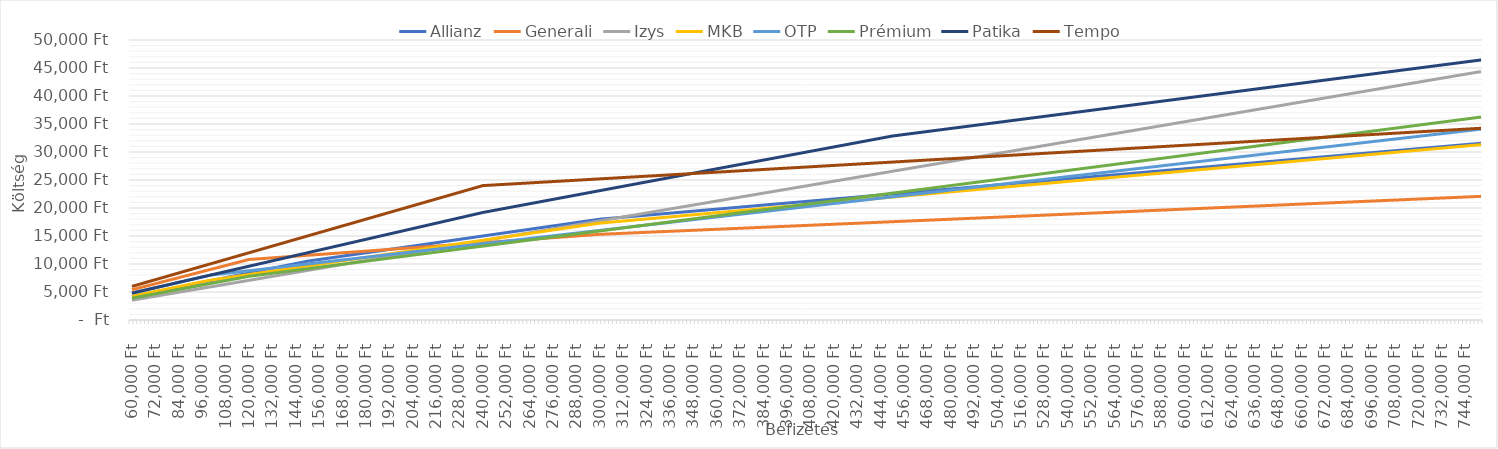
| Category | Allianz | Generali | Izys | MKB | OTP | Prémium | Patika | Tempo |
|---|---|---|---|---|---|---|---|---|
| 60000.0 | 4200 | 5400 | 3540 | 4260 | 4800 | 3900 | 4800 | 6000 |
| 62000.0 | 4340 | 5580 | 3658 | 4402 | 4960 | 4030 | 4960 | 6200 |
| 64000.0 | 4480 | 5760 | 3776 | 4544 | 5120 | 4160 | 5120 | 6400 |
| 66000.0 | 4620 | 5940 | 3894 | 4686 | 5280 | 4290 | 5280 | 6600 |
| 68000.0 | 4760 | 6120 | 4012 | 4828 | 5440 | 4420 | 5440 | 6800 |
| 70000.0 | 4900 | 6300 | 4130 | 4970 | 5600 | 4550 | 5600 | 7000 |
| 72000.0 | 5040 | 6480 | 4248 | 5112 | 5760 | 4680 | 5760 | 7200 |
| 74000.0 | 5180 | 6660 | 4366 | 5254 | 5920 | 4810 | 5920 | 7400 |
| 76000.0 | 5320 | 6840 | 4484 | 5396 | 6080 | 4940 | 6080 | 7600 |
| 78000.0 | 5460 | 7020 | 4602 | 5538 | 6240 | 5070 | 6240 | 7800 |
| 80000.0 | 5600 | 7200 | 4720 | 5680 | 6400 | 5200 | 6400 | 8000 |
| 82000.0 | 5740 | 7380 | 4838 | 5822 | 6560 | 5330 | 6560 | 8200 |
| 84000.0 | 5880 | 7560 | 4956 | 5964 | 6720 | 5460 | 6720 | 8400 |
| 86000.0 | 6020 | 7740 | 5074 | 6106 | 6880 | 5590 | 6880 | 8600 |
| 88000.0 | 6160 | 7920 | 5192 | 6248 | 7040 | 5720 | 7040 | 8800 |
| 90000.0 | 6300 | 8100 | 5310 | 6390 | 7200 | 5850 | 7200 | 9000 |
| 92000.0 | 6440 | 8280 | 5428 | 6532 | 7360 | 5980 | 7360 | 9200 |
| 94000.0 | 6580 | 8460 | 5546 | 6674 | 7520 | 6110 | 7520 | 9400 |
| 96000.0 | 6720 | 8640 | 5664 | 6816 | 7680 | 6240 | 7680 | 9600 |
| 98000.0 | 6860 | 8820 | 5782 | 6958 | 7840 | 6370 | 7840 | 9800 |
| 100000.0 | 7000 | 9000 | 5900 | 7100 | 8000 | 6500 | 8000 | 10000 |
| 102000.0 | 7140 | 9180 | 6018 | 7202 | 8080 | 6630 | 8160 | 10200 |
| 104000.0 | 7280 | 9360 | 6136 | 7304 | 8160 | 6760 | 8320 | 10400 |
| 106000.0 | 7420 | 9540 | 6254 | 7406 | 8240 | 6890 | 8480 | 10600 |
| 108000.0 | 7560 | 9720 | 6372 | 7508 | 8320 | 7020 | 8640 | 10800 |
| 110000.0 | 7700 | 9900 | 6490 | 7610 | 8400 | 7150 | 8800 | 11000 |
| 112000.0 | 7840 | 10080 | 6608 | 7712 | 8480 | 7280 | 8960 | 11200 |
| 114000.0 | 7980 | 10260 | 6726 | 7814 | 8560 | 7410 | 9120 | 11400 |
| 116000.0 | 8120 | 10440 | 6844 | 7916 | 8640 | 7540 | 9280 | 11600 |
| 118000.0 | 8260 | 10620 | 6962 | 8018 | 8720 | 7670 | 9440 | 11800 |
| 120000.0 | 8400 | 10800 | 7080 | 8120 | 8800 | 7800 | 9600 | 12000 |
| 122000.0 | 8540 | 10850 | 7198 | 8222 | 8880 | 7890 | 9760 | 12200 |
| 124000.0 | 8680 | 10900 | 7316 | 8324 | 8960 | 7980 | 9920 | 12400 |
| 126000.0 | 8820 | 10950 | 7434 | 8426 | 9040 | 8070 | 10080 | 12600 |
| 128000.0 | 8960 | 11000 | 7552 | 8528 | 9120 | 8160 | 10240 | 12800 |
| 130000.0 | 9100 | 11050 | 7670 | 8630 | 9200 | 8250 | 10400 | 13000 |
| 132000.0 | 9240 | 11100 | 7788 | 8732 | 9280 | 8340 | 10560 | 13200 |
| 134000.0 | 9380 | 11150 | 7906 | 8834 | 9360 | 8430 | 10720 | 13400 |
| 136000.0 | 9520 | 11200 | 8024 | 8936 | 9440 | 8520 | 10880 | 13600 |
| 138000.0 | 9660 | 11250 | 8142 | 9038 | 9520 | 8610 | 11040 | 13800 |
| 140000.0 | 9800 | 11300 | 8260 | 9140 | 9600 | 8700 | 11200 | 14000 |
| 142000.0 | 9940 | 11350 | 8378 | 9242 | 9680 | 8790 | 11360 | 14200 |
| 144000.0 | 10080 | 11400 | 8496 | 9344 | 9760 | 8880 | 11520 | 14400 |
| 146000.0 | 10220 | 11450 | 8614 | 9446 | 9840 | 8970 | 11680 | 14600 |
| 148000.0 | 10360 | 11500 | 8732 | 9548 | 9920 | 9060 | 11840 | 14800 |
| 150000.0 | 10500 | 11550 | 8850 | 9650 | 10000 | 9150 | 12000 | 15000 |
| 152000.0 | 10600 | 11600 | 8968 | 9752 | 10080 | 9240 | 12160 | 15200 |
| 154000.0 | 10700 | 11650 | 9086 | 9854 | 10160 | 9330 | 12320 | 15400 |
| 156000.0 | 10800 | 11700 | 9204 | 9956 | 10240 | 9420 | 12480 | 15600 |
| 158000.0 | 10900 | 11750 | 9322 | 10058 | 10320 | 9510 | 12640 | 15800 |
| 160000.0 | 11000 | 11800 | 9440 | 10160 | 10400 | 9600 | 12800 | 16000 |
| 162000.0 | 11100 | 11850 | 9558 | 10262 | 10480 | 9690 | 12960 | 16200 |
| 164000.0 | 11200 | 11900 | 9676 | 10364 | 10560 | 9780 | 13120 | 16400 |
| 166000.0 | 11300 | 11950 | 9794 | 10466 | 10640 | 9870 | 13280 | 16600 |
| 168000.0 | 11400 | 12000 | 9912 | 10568 | 10720 | 9960 | 13440 | 16800 |
| 170000.0 | 11500 | 12050 | 10030 | 10670 | 10800 | 10050 | 13600 | 17000 |
| 172000.0 | 11600 | 12100 | 10148 | 10772 | 10880 | 10140 | 13760 | 17200 |
| 174000.0 | 11700 | 12150 | 10266 | 10874 | 10960 | 10230 | 13920 | 17400 |
| 176000.0 | 11800 | 12200 | 10384 | 10976 | 11040 | 10320 | 14080 | 17600 |
| 178000.0 | 11900 | 12250 | 10502 | 11078 | 11120 | 10410 | 14240 | 17800 |
| 180000.0 | 12000 | 12300 | 10620 | 11180 | 11200 | 10500 | 14400 | 18000 |
| 182000.0 | 12100 | 12350 | 10738 | 11282 | 11280 | 10590 | 14560 | 18200 |
| 184000.0 | 12200 | 12400 | 10856 | 11384 | 11360 | 10680 | 14720 | 18400 |
| 186000.0 | 12300 | 12450 | 10974 | 11486 | 11440 | 10770 | 14880 | 18600 |
| 188000.0 | 12400 | 12500 | 11092 | 11588 | 11520 | 10860 | 15040 | 18800 |
| 190000.0 | 12500 | 12550 | 11210 | 11690 | 11600 | 10950 | 15200 | 19000 |
| 192000.0 | 12600 | 12600 | 11328 | 11792 | 11680 | 11040 | 15360 | 19200 |
| 194000.0 | 12700 | 12650 | 11446 | 11894 | 11760 | 11130 | 15520 | 19400 |
| 196000.0 | 12800 | 12700 | 11564 | 11996 | 11840 | 11220 | 15680 | 19600 |
| 198000.0 | 12900 | 12750 | 11682 | 12098 | 11920 | 11310 | 15840 | 19800 |
| 200000.0 | 13000 | 12800 | 11800 | 12200 | 12000 | 11400 | 16000 | 20000 |
| 202000.0 | 13100 | 12850 | 11918 | 12302 | 12080 | 11490 | 16160 | 20200 |
| 204000.0 | 13200 | 12900 | 12036 | 12404 | 12160 | 11580 | 16320 | 20400 |
| 206000.0 | 13300 | 12950 | 12154 | 12506 | 12240 | 11670 | 16480 | 20600 |
| 208000.0 | 13400 | 13000 | 12272 | 12608 | 12320 | 11760 | 16640 | 20800 |
| 210000.0 | 13500 | 13050 | 12390 | 12710 | 12400 | 11850 | 16800 | 21000 |
| 212000.0 | 13600 | 13100 | 12508 | 12812 | 12480 | 11940 | 16960 | 21200 |
| 214000.0 | 13700 | 13150 | 12626 | 12914 | 12560 | 12030 | 17120 | 21400 |
| 216000.0 | 13800 | 13200 | 12744 | 13016 | 12640 | 12120 | 17280 | 21600 |
| 218000.0 | 13900 | 13250 | 12862 | 13118 | 12720 | 12210 | 17440 | 21800 |
| 220000.0 | 14000 | 13300 | 12980 | 13220 | 12800 | 12300 | 17600 | 22000 |
| 222000.0 | 14100 | 13350 | 13098 | 13322 | 12880 | 12390 | 17760 | 22200 |
| 224000.0 | 14200 | 13400 | 13216 | 13424 | 12960 | 12480 | 17920 | 22400 |
| 226000.0 | 14300 | 13450 | 13334 | 13526 | 13040 | 12570 | 18080 | 22600 |
| 228000.0 | 14400 | 13500 | 13452 | 13628 | 13120 | 12660 | 18240 | 22800 |
| 230000.0 | 14500 | 13550 | 13570 | 13730 | 13200 | 12750 | 18400 | 23000 |
| 232000.0 | 14600 | 13600 | 13688 | 13832 | 13280 | 12840 | 18560 | 23200 |
| 234000.0 | 14700 | 13650 | 13806 | 13934 | 13360 | 12930 | 18720 | 23400 |
| 236000.0 | 14800 | 13700 | 13924 | 14036 | 13440 | 13020 | 18880 | 23600 |
| 238000.0 | 14900 | 13750 | 14042 | 14138 | 13520 | 13110 | 19040 | 23800 |
| 240000.0 | 15000 | 13800 | 14160 | 14240 | 13600 | 13200 | 19200 | 24000 |
| 242000.0 | 15100 | 13850 | 14278 | 14342 | 13680 | 13290 | 19330 | 24040 |
| 244000.0 | 15200 | 13900 | 14396 | 14444 | 13760 | 13380 | 19460 | 24080 |
| 246000.0 | 15300 | 13950 | 14514 | 14546 | 13840 | 13470 | 19590 | 24120 |
| 248000.0 | 15400 | 14000 | 14632 | 14648 | 13920 | 13560 | 19720 | 24160 |
| 250000.0 | 15500 | 14050 | 14750 | 14750 | 14000 | 13650 | 19850 | 24200 |
| 252000.0 | 15600 | 14100 | 14868 | 14852 | 14080 | 13740 | 19980 | 24240 |
| 254000.0 | 15700 | 14150 | 14986 | 14954 | 14160 | 13830 | 20110 | 24280 |
| 256000.0 | 15800 | 14200 | 15104 | 15056 | 14240 | 13920 | 20240 | 24320 |
| 258000.0 | 15900 | 14250 | 15222 | 15158 | 14320 | 14010 | 20370 | 24360 |
| 260000.0 | 16000 | 14300 | 15340 | 15260 | 14400 | 14100 | 20500 | 24400 |
| 262000.0 | 16100 | 14350 | 15458 | 15362 | 14480 | 14190 | 20630 | 24440 |
| 264000.0 | 16200 | 14400 | 15576 | 15464 | 14560 | 14280 | 20760 | 24480 |
| 266000.0 | 16300 | 14450 | 15694 | 15566 | 14640 | 14370 | 20890 | 24520 |
| 268000.0 | 16400 | 14500 | 15812 | 15668 | 14720 | 14460 | 21020 | 24560 |
| 270000.0 | 16500 | 14550 | 15930 | 15770 | 14800 | 14550 | 21150 | 24600 |
| 272000.0 | 16600 | 14600 | 16048 | 15872 | 14880 | 14640 | 21280 | 24640 |
| 274000.0 | 16700 | 14650 | 16166 | 15974 | 14960 | 14730 | 21410 | 24680 |
| 276000.0 | 16800 | 14700 | 16284 | 16076 | 15040 | 14820 | 21540 | 24720 |
| 278000.0 | 16900 | 14750 | 16402 | 16178 | 15120 | 14910 | 21670 | 24760 |
| 280000.0 | 17000 | 14800 | 16520 | 16280 | 15200 | 15000 | 21800 | 24800 |
| 282000.0 | 17100 | 14850 | 16638 | 16382 | 15280 | 15090 | 21930 | 24840 |
| 284000.0 | 17200 | 14900 | 16756 | 16484 | 15360 | 15180 | 22060 | 24880 |
| 286000.0 | 17300 | 14950 | 16874 | 16586 | 15440 | 15270 | 22190 | 24920 |
| 288000.0 | 17400 | 15000 | 16992 | 16688 | 15520 | 15360 | 22320 | 24960 |
| 290000.0 | 17500 | 15050 | 17110 | 16790 | 15600 | 15450 | 22450 | 25000 |
| 292000.0 | 17600 | 15100 | 17228 | 16892 | 15680 | 15540 | 22580 | 25040 |
| 294000.0 | 17700 | 15150 | 17346 | 16994 | 15760 | 15630 | 22710 | 25080 |
| 296000.0 | 17800 | 15200 | 17464 | 17096 | 15840 | 15720 | 22840 | 25120 |
| 298000.0 | 17900 | 15250 | 17582 | 17198 | 15920 | 15810 | 22970 | 25160 |
| 300000.0 | 18000 | 15300 | 17700 | 17300 | 16000 | 15900 | 23100 | 25200 |
| 302000.0 | 18060 | 15330 | 17818 | 17362 | 16080 | 15990 | 23230 | 25240 |
| 304000.0 | 18120 | 15360 | 17936 | 17424 | 16160 | 16080 | 23360 | 25280 |
| 306000.0 | 18180 | 15390 | 18054 | 17486 | 16240 | 16170 | 23490 | 25320 |
| 308000.0 | 18240 | 15420 | 18172 | 17548 | 16320 | 16260 | 23620 | 25360 |
| 310000.0 | 18300 | 15450 | 18290 | 17610 | 16400 | 16350 | 23750 | 25400 |
| 312000.0 | 18360 | 15480 | 18408 | 17672 | 16480 | 16440 | 23880 | 25440 |
| 314000.0 | 18420 | 15510 | 18526 | 17734 | 16560 | 16530 | 24010 | 25480 |
| 316000.0 | 18480 | 15540 | 18644 | 17796 | 16640 | 16620 | 24140 | 25520 |
| 318000.0 | 18540 | 15570 | 18762 | 17858 | 16720 | 16710 | 24270 | 25560 |
| 320000.0 | 18600 | 15600 | 18880 | 17920 | 16800 | 16800 | 24400 | 25600 |
| 322000.0 | 18660 | 15630 | 18998 | 17982 | 16880 | 16890 | 24530 | 25640 |
| 324000.0 | 18720 | 15660 | 19116 | 18044 | 16960 | 16980 | 24660 | 25680 |
| 326000.0 | 18780 | 15690 | 19234 | 18106 | 17040 | 17070 | 24790 | 25720 |
| 328000.0 | 18840 | 15720 | 19352 | 18168 | 17120 | 17160 | 24920 | 25760 |
| 330000.0 | 18900 | 15750 | 19470 | 18230 | 17200 | 17250 | 25050 | 25800 |
| 332000.0 | 18960 | 15780 | 19588 | 18292 | 17280 | 17340 | 25180 | 25840 |
| 334000.0 | 19020 | 15810 | 19706 | 18354 | 17360 | 17430 | 25310 | 25880 |
| 336000.0 | 19080 | 15840 | 19824 | 18416 | 17440 | 17520 | 25440 | 25920 |
| 338000.0 | 19140 | 15870 | 19942 | 18478 | 17520 | 17610 | 25570 | 25960 |
| 340000.0 | 19200 | 15900 | 20060 | 18540 | 17600 | 17700 | 25700 | 26000 |
| 342000.0 | 19260 | 15930 | 20178 | 18602 | 17680 | 17790 | 25830 | 26040 |
| 344000.0 | 19320 | 15960 | 20296 | 18664 | 17760 | 17880 | 25960 | 26080 |
| 346000.0 | 19380 | 15990 | 20414 | 18726 | 17840 | 17970 | 26090 | 26120 |
| 348000.0 | 19440 | 16020 | 20532 | 18788 | 17920 | 18060 | 26220 | 26160 |
| 350000.0 | 19500 | 16050 | 20650 | 18850 | 18000 | 18150 | 26350 | 26200 |
| 352000.0 | 19560 | 16080 | 20768 | 18912 | 18080 | 18240 | 26480 | 26240 |
| 354000.0 | 19620 | 16110 | 20886 | 18974 | 18160 | 18330 | 26610 | 26280 |
| 356000.0 | 19680 | 16140 | 21004 | 19036 | 18240 | 18420 | 26740 | 26320 |
| 358000.0 | 19740 | 16170 | 21122 | 19098 | 18320 | 18510 | 26870 | 26360 |
| 360000.0 | 19800 | 16200 | 21240 | 19160 | 18400 | 18600 | 27000 | 26400 |
| 362000.0 | 19860 | 16230 | 21358 | 19222 | 18480 | 18690 | 27130 | 26440 |
| 364000.0 | 19920 | 16260 | 21476 | 19284 | 18560 | 18780 | 27260 | 26480 |
| 366000.0 | 19980 | 16290 | 21594 | 19346 | 18640 | 18870 | 27390 | 26520 |
| 368000.0 | 20040 | 16320 | 21712 | 19408 | 18720 | 18960 | 27520 | 26560 |
| 370000.0 | 20100 | 16350 | 21830 | 19470 | 18800 | 19050 | 27650 | 26600 |
| 372000.0 | 20160 | 16380 | 21948 | 19532 | 18880 | 19140 | 27780 | 26640 |
| 374000.0 | 20220 | 16410 | 22066 | 19594 | 18960 | 19230 | 27910 | 26680 |
| 376000.0 | 20280 | 16440 | 22184 | 19656 | 19040 | 19320 | 28040 | 26720 |
| 378000.0 | 20340 | 16470 | 22302 | 19718 | 19120 | 19410 | 28170 | 26760 |
| 380000.0 | 20400 | 16500 | 22420 | 19780 | 19200 | 19500 | 28300 | 26800 |
| 382000.0 | 20460 | 16530 | 22538 | 19842 | 19280 | 19590 | 28430 | 26840 |
| 384000.0 | 20520 | 16560 | 22656 | 19904 | 19360 | 19680 | 28560 | 26880 |
| 386000.0 | 20580 | 16590 | 22774 | 19966 | 19440 | 19770 | 28690 | 26920 |
| 388000.0 | 20640 | 16620 | 22892 | 20028 | 19520 | 19860 | 28820 | 26960 |
| 390000.0 | 20700 | 16650 | 23010 | 20090 | 19600 | 19950 | 28950 | 27000 |
| 392000.0 | 20760 | 16680 | 23128 | 20152 | 19680 | 20040 | 29080 | 27040 |
| 394000.0 | 20820 | 16710 | 23246 | 20214 | 19760 | 20130 | 29210 | 27080 |
| 396000.0 | 20880 | 16740 | 23364 | 20276 | 19840 | 20220 | 29340 | 27120 |
| 398000.0 | 20940 | 16770 | 23482 | 20338 | 19920 | 20310 | 29470 | 27160 |
| 400000.0 | 21000 | 16800 | 23600 | 20400 | 20000 | 20400 | 29600 | 27200 |
| 402000.0 | 21060 | 16830 | 23718 | 20462 | 20080 | 20490 | 29730 | 27240 |
| 404000.0 | 21120 | 16860 | 23836 | 20524 | 20160 | 20580 | 29860 | 27280 |
| 406000.0 | 21180 | 16890 | 23954 | 20586 | 20240 | 20670 | 29990 | 27320 |
| 408000.0 | 21240 | 16920 | 24072 | 20648 | 20320 | 20760 | 30120 | 27360 |
| 410000.0 | 21300 | 16950 | 24190 | 20710 | 20400 | 20850 | 30250 | 27400 |
| 412000.0 | 21360 | 16980 | 24308 | 20772 | 20480 | 20940 | 30380 | 27440 |
| 414000.0 | 21420 | 17010 | 24426 | 20834 | 20560 | 21030 | 30510 | 27480 |
| 416000.0 | 21480 | 17040 | 24544 | 20896 | 20640 | 21120 | 30640 | 27520 |
| 418000.0 | 21540 | 17070 | 24662 | 20958 | 20720 | 21210 | 30770 | 27560 |
| 420000.0 | 21600 | 17100 | 24780 | 21020 | 20800 | 21300 | 30900 | 27600 |
| 422000.0 | 21660 | 17130 | 24898 | 21082 | 20880 | 21390 | 31030 | 27640 |
| 424000.0 | 21720 | 17160 | 25016 | 21144 | 20960 | 21480 | 31160 | 27680 |
| 426000.0 | 21780 | 17190 | 25134 | 21206 | 21040 | 21570 | 31290 | 27720 |
| 428000.0 | 21840 | 17220 | 25252 | 21268 | 21120 | 21660 | 31420 | 27760 |
| 430000.0 | 21900 | 17250 | 25370 | 21330 | 21200 | 21750 | 31550 | 27800 |
| 432000.0 | 21960 | 17280 | 25488 | 21392 | 21280 | 21840 | 31680 | 27840 |
| 434000.0 | 22020 | 17310 | 25606 | 21454 | 21360 | 21930 | 31810 | 27880 |
| 436000.0 | 22080 | 17340 | 25724 | 21516 | 21440 | 22020 | 31940 | 27920 |
| 438000.0 | 22140 | 17370 | 25842 | 21578 | 21520 | 22110 | 32070 | 27960 |
| 440000.0 | 22200 | 17400 | 25960 | 21640 | 21600 | 22200 | 32200 | 28000 |
| 442000.0 | 22260 | 17430 | 26078 | 21702 | 21680 | 22290 | 32330 | 28040 |
| 444000.0 | 22320 | 17460 | 26196 | 21764 | 21760 | 22380 | 32460 | 28080 |
| 446000.0 | 22380 | 17490 | 26314 | 21826 | 21840 | 22470 | 32590 | 28120 |
| 448000.0 | 22440 | 17520 | 26432 | 21888 | 21920 | 22560 | 32720 | 28160 |
| 450000.0 | 22500 | 17550 | 26550 | 21950 | 22000 | 22650 | 32850 | 28200 |
| 452000.0 | 22560 | 17580 | 26668 | 22012 | 22080 | 22740 | 32940 | 28240 |
| 454000.0 | 22620 | 17610 | 26786 | 22074 | 22160 | 22830 | 33030 | 28280 |
| 456000.0 | 22680 | 17640 | 26904 | 22136 | 22240 | 22920 | 33120 | 28320 |
| 458000.0 | 22740 | 17670 | 27022 | 22198 | 22320 | 23010 | 33210 | 28360 |
| 460000.0 | 22800 | 17700 | 27140 | 22260 | 22400 | 23100 | 33300 | 28400 |
| 462000.0 | 22860 | 17730 | 27258 | 22322 | 22480 | 23190 | 33390 | 28440 |
| 464000.0 | 22920 | 17760 | 27376 | 22384 | 22560 | 23280 | 33480 | 28480 |
| 466000.0 | 22980 | 17790 | 27494 | 22446 | 22640 | 23370 | 33570 | 28520 |
| 468000.0 | 23040 | 17820 | 27612 | 22508 | 22720 | 23460 | 33660 | 28560 |
| 470000.0 | 23100 | 17850 | 27730 | 22570 | 22800 | 23550 | 33750 | 28600 |
| 472000.0 | 23160 | 17880 | 27848 | 22632 | 22880 | 23640 | 33840 | 28640 |
| 474000.0 | 23220 | 17910 | 27966 | 22694 | 22960 | 23730 | 33930 | 28680 |
| 476000.0 | 23280 | 17940 | 28084 | 22756 | 23040 | 23820 | 34020 | 28720 |
| 478000.0 | 23340 | 17970 | 28202 | 22818 | 23120 | 23910 | 34110 | 28760 |
| 480000.0 | 23400 | 18000 | 28320 | 22880 | 23200 | 24000 | 34200 | 28800 |
| 482000.0 | 23460 | 18030 | 28438 | 22942 | 23280 | 24090 | 34290 | 28840 |
| 484000.0 | 23520 | 18060 | 28556 | 23004 | 23360 | 24180 | 34380 | 28880 |
| 486000.0 | 23580 | 18090 | 28674 | 23066 | 23440 | 24270 | 34470 | 28920 |
| 488000.0 | 23640 | 18120 | 28792 | 23128 | 23520 | 24360 | 34560 | 28960 |
| 490000.0 | 23700 | 18150 | 28910 | 23190 | 23600 | 24450 | 34650 | 29000 |
| 492000.0 | 23760 | 18180 | 29028 | 23252 | 23680 | 24540 | 34740 | 29040 |
| 494000.0 | 23820 | 18210 | 29146 | 23314 | 23760 | 24630 | 34830 | 29080 |
| 496000.0 | 23880 | 18240 | 29264 | 23376 | 23840 | 24720 | 34920 | 29120 |
| 498000.0 | 23940 | 18270 | 29382 | 23438 | 23920 | 24810 | 35010 | 29160 |
| 500000.0 | 24000 | 18300 | 29500 | 23500 | 24000 | 24900 | 35100 | 29200 |
| 502000.0 | 24060 | 18330 | 29618 | 23562 | 24080 | 24990 | 35190 | 29240 |
| 504000.0 | 24120 | 18360 | 29736 | 23624 | 24160 | 25080 | 35280 | 29280 |
| 506000.0 | 24180 | 18390 | 29854 | 23686 | 24240 | 25170 | 35370 | 29320 |
| 508000.0 | 24240 | 18420 | 29972 | 23748 | 24320 | 25260 | 35460 | 29360 |
| 510000.0 | 24300 | 18450 | 30090 | 23810 | 24400 | 25350 | 35550 | 29400 |
| 512000.0 | 24360 | 18480 | 30208 | 23872 | 24480 | 25440 | 35640 | 29440 |
| 514000.0 | 24420 | 18510 | 30326 | 23934 | 24560 | 25530 | 35730 | 29480 |
| 516000.0 | 24480 | 18540 | 30444 | 23996 | 24640 | 25620 | 35820 | 29520 |
| 518000.0 | 24540 | 18570 | 30562 | 24058 | 24720 | 25710 | 35910 | 29560 |
| 520000.0 | 24600 | 18600 | 30680 | 24120 | 24800 | 25800 | 36000 | 29600 |
| 522000.0 | 24660 | 18630 | 30798 | 24182 | 24880 | 25890 | 36090 | 29640 |
| 524000.0 | 24720 | 18660 | 30916 | 24244 | 24960 | 25980 | 36180 | 29680 |
| 526000.0 | 24780 | 18690 | 31034 | 24306 | 25040 | 26070 | 36270 | 29720 |
| 528000.0 | 24840 | 18720 | 31152 | 24368 | 25120 | 26160 | 36360 | 29760 |
| 530000.0 | 24900 | 18750 | 31270 | 24430 | 25200 | 26250 | 36450 | 29800 |
| 532000.0 | 24960 | 18780 | 31388 | 24492 | 25280 | 26340 | 36540 | 29840 |
| 534000.0 | 25020 | 18810 | 31506 | 24554 | 25360 | 26430 | 36630 | 29880 |
| 536000.0 | 25080 | 18840 | 31624 | 24616 | 25440 | 26520 | 36720 | 29920 |
| 538000.0 | 25140 | 18870 | 31742 | 24678 | 25520 | 26610 | 36810 | 29960 |
| 540000.0 | 25200 | 18900 | 31860 | 24740 | 25600 | 26700 | 36900 | 30000 |
| 542000.0 | 25260 | 18930 | 31978 | 24802 | 25680 | 26790 | 36990 | 30040 |
| 544000.0 | 25320 | 18960 | 32096 | 24864 | 25760 | 26880 | 37080 | 30080 |
| 546000.0 | 25380 | 18990 | 32214 | 24926 | 25840 | 26970 | 37170 | 30120 |
| 548000.0 | 25440 | 19020 | 32332 | 24988 | 25920 | 27060 | 37260 | 30160 |
| 550000.0 | 25500 | 19050 | 32450 | 25050 | 26000 | 27150 | 37350 | 30200 |
| 552000.0 | 25560 | 19080 | 32568 | 25112 | 26080 | 27240 | 37440 | 30240 |
| 554000.0 | 25620 | 19110 | 32686 | 25174 | 26160 | 27330 | 37530 | 30280 |
| 556000.0 | 25680 | 19140 | 32804 | 25236 | 26240 | 27420 | 37620 | 30320 |
| 558000.0 | 25740 | 19170 | 32922 | 25298 | 26320 | 27510 | 37710 | 30360 |
| 560000.0 | 25800 | 19200 | 33040 | 25360 | 26400 | 27600 | 37800 | 30400 |
| 562000.0 | 25860 | 19230 | 33158 | 25422 | 26480 | 27690 | 37890 | 30440 |
| 564000.0 | 25920 | 19260 | 33276 | 25484 | 26560 | 27780 | 37980 | 30480 |
| 566000.0 | 25980 | 19290 | 33394 | 25546 | 26640 | 27870 | 38070 | 30520 |
| 568000.0 | 26040 | 19320 | 33512 | 25608 | 26720 | 27960 | 38160 | 30560 |
| 570000.0 | 26100 | 19350 | 33630 | 25670 | 26800 | 28050 | 38250 | 30600 |
| 572000.0 | 26160 | 19380 | 33748 | 25732 | 26880 | 28140 | 38340 | 30640 |
| 574000.0 | 26220 | 19410 | 33866 | 25794 | 26960 | 28230 | 38430 | 30680 |
| 576000.0 | 26280 | 19440 | 33984 | 25856 | 27040 | 28320 | 38520 | 30720 |
| 578000.0 | 26340 | 19470 | 34102 | 25918 | 27120 | 28410 | 38610 | 30760 |
| 580000.0 | 26400 | 19500 | 34220 | 25980 | 27200 | 28500 | 38700 | 30800 |
| 582000.0 | 26460 | 19530 | 34338 | 26042 | 27280 | 28590 | 38790 | 30840 |
| 584000.0 | 26520 | 19560 | 34456 | 26104 | 27360 | 28680 | 38880 | 30880 |
| 586000.0 | 26580 | 19590 | 34574 | 26166 | 27440 | 28770 | 38970 | 30920 |
| 588000.0 | 26640 | 19620 | 34692 | 26228 | 27520 | 28860 | 39060 | 30960 |
| 590000.0 | 26700 | 19650 | 34810 | 26290 | 27600 | 28950 | 39150 | 31000 |
| 592000.0 | 26760 | 19680 | 34928 | 26352 | 27680 | 29040 | 39240 | 31040 |
| 594000.0 | 26820 | 19710 | 35046 | 26414 | 27760 | 29130 | 39330 | 31080 |
| 596000.0 | 26880 | 19740 | 35164 | 26476 | 27840 | 29220 | 39420 | 31120 |
| 598000.0 | 26940 | 19770 | 35282 | 26538 | 27920 | 29310 | 39510 | 31160 |
| 600000.0 | 27000 | 19800 | 35400 | 26600 | 28000 | 29400 | 39600 | 31200 |
| 602000.0 | 27060 | 19830 | 35518 | 26662 | 28080 | 29490 | 39690 | 31240 |
| 604000.0 | 27120 | 19860 | 35636 | 26724 | 28160 | 29580 | 39780 | 31280 |
| 606000.0 | 27180 | 19890 | 35754 | 26786 | 28240 | 29670 | 39870 | 31320 |
| 608000.0 | 27240 | 19920 | 35872 | 26848 | 28320 | 29760 | 39960 | 31360 |
| 610000.0 | 27300 | 19950 | 35990 | 26910 | 28400 | 29850 | 40050 | 31400 |
| 612000.0 | 27360 | 19980 | 36108 | 26972 | 28480 | 29940 | 40140 | 31440 |
| 614000.0 | 27420 | 20010 | 36226 | 27034 | 28560 | 30030 | 40230 | 31480 |
| 616000.0 | 27480 | 20040 | 36344 | 27096 | 28640 | 30120 | 40320 | 31520 |
| 618000.0 | 27540 | 20070 | 36462 | 27158 | 28720 | 30210 | 40410 | 31560 |
| 620000.0 | 27600 | 20100 | 36580 | 27220 | 28800 | 30300 | 40500 | 31600 |
| 622000.0 | 27660 | 20130 | 36698 | 27282 | 28880 | 30390 | 40590 | 31640 |
| 624000.0 | 27720 | 20160 | 36816 | 27344 | 28960 | 30480 | 40680 | 31680 |
| 626000.0 | 27780 | 20190 | 36934 | 27406 | 29040 | 30570 | 40770 | 31720 |
| 628000.0 | 27840 | 20220 | 37052 | 27468 | 29120 | 30660 | 40860 | 31760 |
| 630000.0 | 27900 | 20250 | 37170 | 27530 | 29200 | 30750 | 40950 | 31800 |
| 632000.0 | 27960 | 20280 | 37288 | 27592 | 29280 | 30840 | 41040 | 31840 |
| 634000.0 | 28020 | 20310 | 37406 | 27654 | 29360 | 30930 | 41130 | 31880 |
| 636000.0 | 28080 | 20340 | 37524 | 27716 | 29440 | 31020 | 41220 | 31920 |
| 638000.0 | 28140 | 20370 | 37642 | 27778 | 29520 | 31110 | 41310 | 31960 |
| 640000.0 | 28200 | 20400 | 37760 | 27840 | 29600 | 31200 | 41400 | 32000 |
| 642000.0 | 28260 | 20430 | 37878 | 27902 | 29680 | 31290 | 41490 | 32040 |
| 644000.0 | 28320 | 20460 | 37996 | 27964 | 29760 | 31380 | 41580 | 32080 |
| 646000.0 | 28380 | 20490 | 38114 | 28026 | 29840 | 31470 | 41670 | 32120 |
| 648000.0 | 28440 | 20520 | 38232 | 28088 | 29920 | 31560 | 41760 | 32160 |
| 650000.0 | 28500 | 20550 | 38350 | 28150 | 30000 | 31650 | 41850 | 32200 |
| 652000.0 | 28560 | 20580 | 38468 | 28212 | 30080 | 31740 | 41940 | 32240 |
| 654000.0 | 28620 | 20610 | 38586 | 28274 | 30160 | 31830 | 42030 | 32280 |
| 656000.0 | 28680 | 20640 | 38704 | 28336 | 30240 | 31920 | 42120 | 32320 |
| 658000.0 | 28740 | 20670 | 38822 | 28398 | 30320 | 32010 | 42210 | 32360 |
| 660000.0 | 28800 | 20700 | 38940 | 28460 | 30400 | 32100 | 42300 | 32400 |
| 662000.0 | 28860 | 20730 | 39058 | 28522 | 30480 | 32190 | 42390 | 32440 |
| 664000.0 | 28920 | 20760 | 39176 | 28584 | 30560 | 32280 | 42480 | 32480 |
| 666000.0 | 28980 | 20790 | 39294 | 28646 | 30640 | 32370 | 42570 | 32520 |
| 668000.0 | 29040 | 20820 | 39412 | 28708 | 30720 | 32460 | 42660 | 32560 |
| 670000.0 | 29100 | 20850 | 39530 | 28770 | 30800 | 32550 | 42750 | 32600 |
| 672000.0 | 29160 | 20880 | 39648 | 28832 | 30880 | 32640 | 42840 | 32640 |
| 674000.0 | 29220 | 20910 | 39766 | 28894 | 30960 | 32730 | 42930 | 32680 |
| 676000.0 | 29280 | 20940 | 39884 | 28956 | 31040 | 32820 | 43020 | 32720 |
| 678000.0 | 29340 | 20970 | 40002 | 29018 | 31120 | 32910 | 43110 | 32760 |
| 680000.0 | 29400 | 21000 | 40120 | 29080 | 31200 | 33000 | 43200 | 32800 |
| 682000.0 | 29460 | 21030 | 40238 | 29142 | 31280 | 33090 | 43290 | 32840 |
| 684000.0 | 29520 | 21060 | 40356 | 29204 | 31360 | 33180 | 43380 | 32880 |
| 686000.0 | 29580 | 21090 | 40474 | 29266 | 31440 | 33270 | 43470 | 32920 |
| 688000.0 | 29640 | 21120 | 40592 | 29328 | 31520 | 33360 | 43560 | 32960 |
| 690000.0 | 29700 | 21150 | 40710 | 29390 | 31600 | 33450 | 43650 | 33000 |
| 692000.0 | 29760 | 21180 | 40828 | 29452 | 31680 | 33540 | 43740 | 33040 |
| 694000.0 | 29820 | 21210 | 40946 | 29514 | 31760 | 33630 | 43830 | 33080 |
| 696000.0 | 29880 | 21240 | 41064 | 29576 | 31840 | 33720 | 43920 | 33120 |
| 698000.0 | 29940 | 21270 | 41182 | 29638 | 31920 | 33810 | 44010 | 33160 |
| 700000.0 | 30000 | 21300 | 41300 | 29700 | 32000 | 33900 | 44100 | 33200 |
| 702000.0 | 30060 | 21330 | 41418 | 29762 | 32080 | 33990 | 44190 | 33240 |
| 704000.0 | 30120 | 21360 | 41536 | 29824 | 32160 | 34080 | 44280 | 33280 |
| 706000.0 | 30180 | 21390 | 41654 | 29886 | 32240 | 34170 | 44370 | 33320 |
| 708000.0 | 30240 | 21420 | 41772 | 29948 | 32320 | 34260 | 44460 | 33360 |
| 710000.0 | 30300 | 21450 | 41890 | 30010 | 32400 | 34350 | 44550 | 33400 |
| 712000.0 | 30360 | 21480 | 42008 | 30072 | 32480 | 34440 | 44640 | 33440 |
| 714000.0 | 30420 | 21510 | 42126 | 30134 | 32560 | 34530 | 44730 | 33480 |
| 716000.0 | 30480 | 21540 | 42244 | 30196 | 32640 | 34620 | 44820 | 33520 |
| 718000.0 | 30540 | 21570 | 42362 | 30258 | 32720 | 34710 | 44910 | 33560 |
| 720000.0 | 30600 | 21600 | 42480 | 30320 | 32800 | 34800 | 45000 | 33600 |
| 722000.0 | 30660 | 21630 | 42598 | 30382 | 32880 | 34890 | 45090 | 33640 |
| 724000.0 | 30720 | 21660 | 42716 | 30444 | 32960 | 34980 | 45180 | 33680 |
| 726000.0 | 30780 | 21690 | 42834 | 30506 | 33040 | 35070 | 45270 | 33720 |
| 728000.0 | 30840 | 21720 | 42952 | 30568 | 33120 | 35160 | 45360 | 33760 |
| 730000.0 | 30900 | 21750 | 43070 | 30630 | 33200 | 35250 | 45450 | 33800 |
| 732000.0 | 30960 | 21780 | 43188 | 30692 | 33280 | 35340 | 45540 | 33840 |
| 734000.0 | 31020 | 21810 | 43306 | 30754 | 33360 | 35430 | 45630 | 33880 |
| 736000.0 | 31080 | 21840 | 43424 | 30816 | 33440 | 35520 | 45720 | 33920 |
| 738000.0 | 31140 | 21870 | 43542 | 30878 | 33520 | 35610 | 45810 | 33960 |
| 740000.0 | 31200 | 21900 | 43660 | 30940 | 33600 | 35700 | 45900 | 34000 |
| 742000.0 | 31260 | 21930 | 43778 | 31002 | 33680 | 35790 | 45990 | 34040 |
| 744000.0 | 31320 | 21960 | 43896 | 31064 | 33760 | 35880 | 46080 | 34080 |
| 746000.0 | 31380 | 21990 | 44014 | 31126 | 33840 | 35970 | 46170 | 34120 |
| 748000.0 | 31440 | 22020 | 44132 | 31188 | 33920 | 36060 | 46260 | 34160 |
| 750000.0 | 31500 | 22050 | 44250 | 31250 | 34000 | 36150 | 46350 | 34200 |
| 752000.0 | 31560 | 22080 | 44368 | 31312 | 34080 | 36240 | 46440 | 34240 |